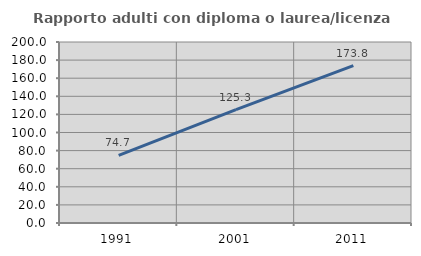
| Category | Rapporto adulti con diploma o laurea/licenza media  |
|---|---|
| 1991.0 | 74.658 |
| 2001.0 | 125.294 |
| 2011.0 | 173.797 |